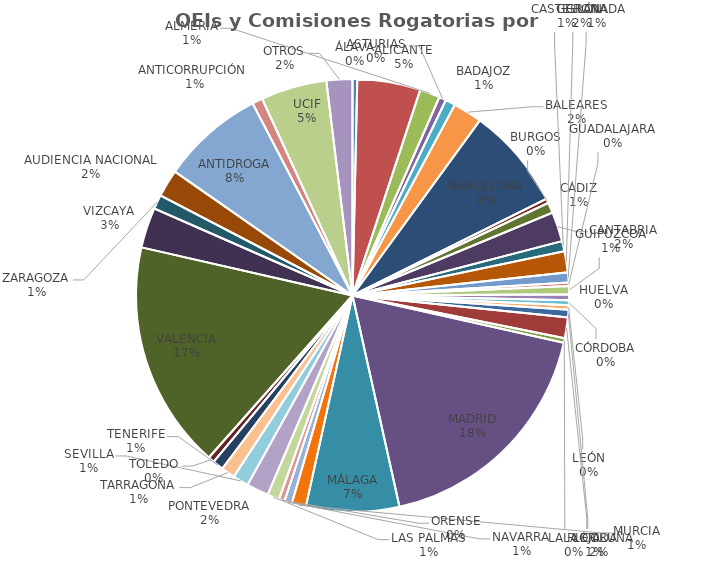
| Category | OEIs y Comisiones Rogatorias |
|---|---|
| ÁLAVA | 15 |
| ALICANTE | 200 |
| ALMERÍA | 64 |
| ASTURIAS | 22 |
| BADAJOZ | 32 |
| BALEARES | 92 |
| BARCELONA | 324 |
| BURGOS | 14 |
| CÁDIZ | 33 |
| CANTABRIA | 94 |
| CASTELLÓN | 32 |
| GERONA | 67 |
| GRANADA | 32 |
| GUADALAJARA | 11 |
| GUIPÚZCOA | 26 |
| HUELVA | 18 |
| CÓRDOBA | 16 |
| LEÓN | 14 |
| LÉRIDA | 24 |
| LA CORUÑA | 66 |
| LA RIOJA | 14 |
| MADRID | 765 |
| MÁLAGA | 295 |
| MURCIA | 45 |
| NAVARRA | 24 |
| ORENSE | 18 |
| LAS PALMAS | 38 |
| PONTEVEDRA | 70 |
| SEVILLA | 50 |
| TARRAGONA | 44 |
| TENERIFE | 34 |
| TOLEDO | 20 |
| VALENCIA | 723 |
| VIZCAYA | 128 |
| ZARAGOZA | 45 |
| AUDIENCIA NACIONAL | 87 |
| ANTIDROGA | 326 |
| ANTICORRUPCIÓN  | 33 |
| UCIF | 209 |
| OTROS | 82 |